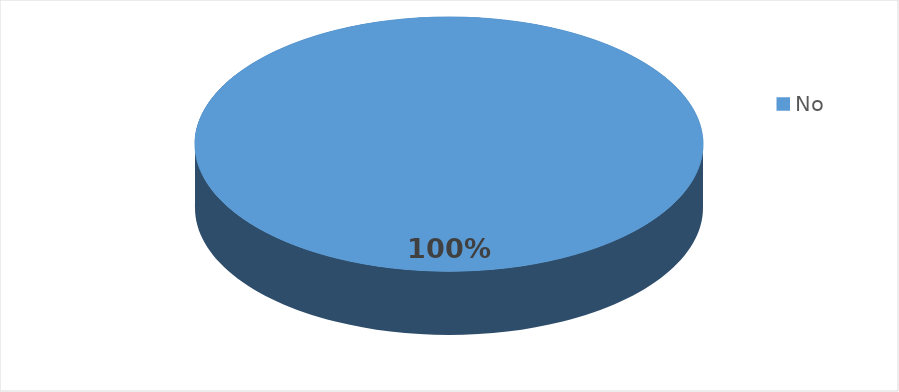
| Category | Frecuencia |
|---|---|
| No | 6 |